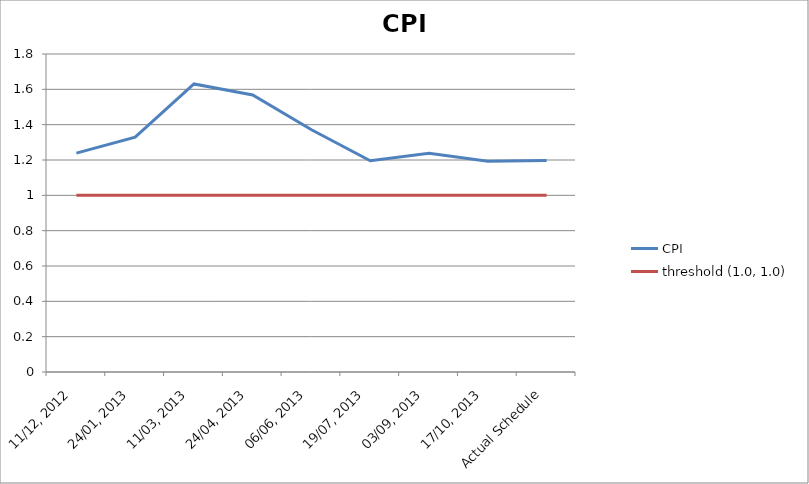
| Category | CPI | threshold (1.0, 1.0) |
|---|---|---|
| 11/12, 2012 | 1.239 | 1 |
| 24/01, 2013 | 1.33 | 1 |
| 11/03, 2013 | 1.63 | 1 |
| 24/04, 2013 | 1.568 | 1 |
| 06/06, 2013 | 1.371 | 1 |
| 19/07, 2013 | 1.196 | 1 |
| 03/09, 2013 | 1.239 | 1 |
| 17/10, 2013 | 1.193 | 1 |
| Actual Schedule | 1.197 | 1 |